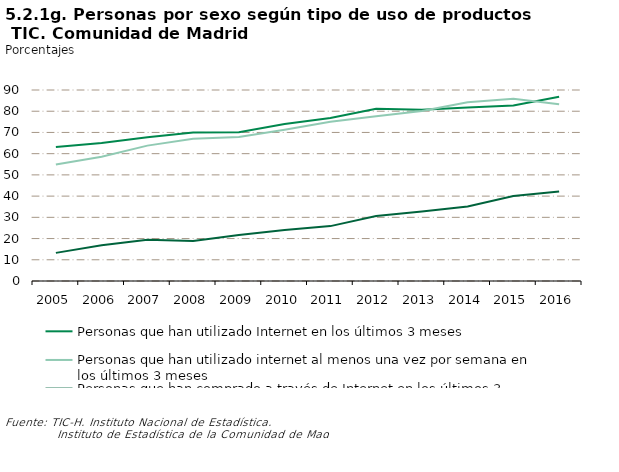
| Category | Personas que han utilizado Internet en los últimos 3 meses | Personas que han utilizado internet al menos una vez por semana en los últimos 3 meses | Personas que han comprado a través de Internet en los últimos 3 meses |
|---|---|---|---|
| 2005.0 | 63.101 | 54.897 | 13.253 |
| 2006.0 | 64.983 | 58.563 | 16.796 |
| 2007.0 | 67.717 | 63.787 | 19.491 |
| 2008.0 | 70.018 | 67.009 | 18.796 |
| 2009.0 | 70.055 | 67.82 | 21.656 |
| 2010.0 | 73.967 | 71.257 | 23.981 |
| 2011.0 | 76.771 | 75.03 | 25.861 |
| 2012.0 | 81.167 | 77.661 | 30.675 |
| 2013.0 | 80.7 | 80.1 | 32.8 |
| 2014.0 | 81.734 | 84.191 | 35.065 |
| 2015.0 | 82.68 | 85.864 | 40.072 |
| 2016.0 | 86.857 | 83.233 | 42.165 |